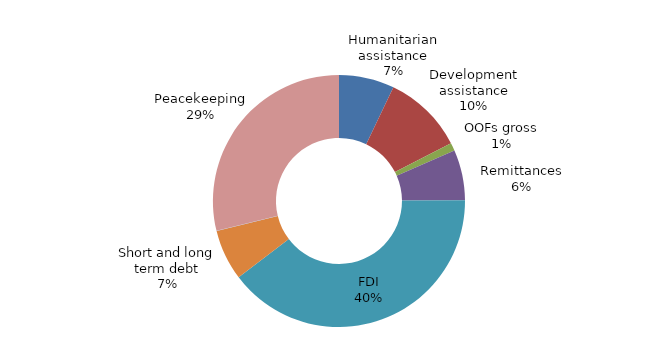
| Category | Series 0 |
|---|---|
| Humanitarian assistance | 0.441 |
| Development assistance | 0.64 |
| OOFs gross | 0.063 |
| Remittances | 0.401 |
| FDI | 2.466 |
| Short and long term debt | 0.405 |
| Portfolio equity | 0.002 |
| Peacekeeping | 1.786 |